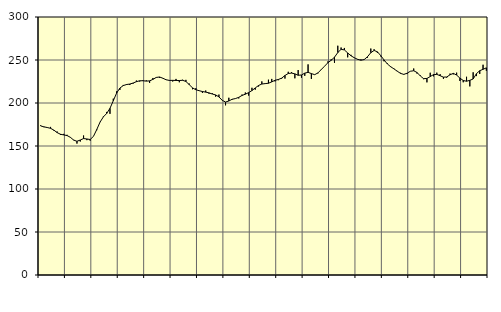
| Category | Piggar | Series 1 |
|---|---|---|
| nan | 174.1 | 173.34 |
| 87.0 | 171.9 | 172.28 |
| 87.0 | 171.8 | 171.48 |
| 87.0 | 172.2 | 170.55 |
| nan | 167.9 | 168.46 |
| 88.0 | 166.8 | 165.57 |
| 88.0 | 162.8 | 163.67 |
| 88.0 | 164.1 | 162.88 |
| nan | 163 | 162.13 |
| 89.0 | 159.8 | 160.11 |
| 89.0 | 157.2 | 156.85 |
| 89.0 | 152.8 | 155.47 |
| nan | 155.2 | 156.97 |
| 90.0 | 162.2 | 158.65 |
| 90.0 | 156.8 | 158.16 |
| 90.0 | 156.2 | 157.57 |
| nan | 161.4 | 161.25 |
| 91.0 | 168.4 | 169.17 |
| 91.0 | 178 | 177.82 |
| 91.0 | 184.4 | 183.87 |
| nan | 189.6 | 187.83 |
| 92.0 | 187.4 | 193.79 |
| 92.0 | 205 | 202.62 |
| 92.0 | 213.5 | 211.45 |
| nan | 215.2 | 217.35 |
| 93.0 | 221 | 220.23 |
| 93.0 | 222 | 221.47 |
| 93.0 | 220.9 | 222.05 |
| nan | 222.5 | 223.21 |
| 94.0 | 226.1 | 224.79 |
| 94.0 | 225 | 225.85 |
| 94.0 | 226.5 | 225.86 |
| nan | 226.3 | 225.44 |
| 95.0 | 223.4 | 225.72 |
| 95.0 | 229.1 | 227.46 |
| 95.0 | 229.5 | 229.7 |
| nan | 229.3 | 230.26 |
| 96.0 | 228.6 | 228.83 |
| 96.0 | 226.8 | 227 |
| 96.0 | 225.8 | 226.27 |
| nan | 225 | 226.34 |
| 97.0 | 228 | 226.21 |
| 97.0 | 224.1 | 226.14 |
| 97.0 | 227 | 226.4 |
| nan | 226.9 | 225.05 |
| 98.0 | 222.6 | 221.4 |
| 98.0 | 216 | 217.59 |
| 98.0 | 217.2 | 215.44 |
| nan | 214.5 | 214.3 |
| 99.0 | 211.7 | 213.34 |
| 99.0 | 214.5 | 212.63 |
| 99.0 | 210.8 | 211.78 |
| nan | 211.3 | 210.42 |
| 0.0 | 207.4 | 209.39 |
| 0.0 | 209.8 | 207.12 |
| 0.0 | 203.3 | 203.12 |
| nan | 197.3 | 201.14 |
| 1.0 | 206.1 | 202.31 |
| 1.0 | 203.8 | 204.35 |
| 1.0 | 205 | 205.15 |
| nan | 205.3 | 206.59 |
| 2.0 | 209.8 | 208.77 |
| 2.0 | 212.2 | 210.23 |
| 2.0 | 208.6 | 212.05 |
| nan | 217.7 | 214.48 |
| 3.0 | 215.5 | 217.5 |
| 3.0 | 219.2 | 220.37 |
| 3.0 | 225.1 | 222.04 |
| nan | 222.8 | 222.53 |
| 4.0 | 227.1 | 222.96 |
| 4.0 | 228 | 224.56 |
| 4.0 | 225.1 | 226.4 |
| nan | 226.5 | 227.35 |
| 5.0 | 228.2 | 228.9 |
| 5.0 | 228.4 | 232.01 |
| 5.0 | 236.3 | 234.28 |
| nan | 235.9 | 234.79 |
| 6.0 | 228.7 | 233.89 |
| 6.0 | 238.3 | 232.22 |
| 6.0 | 229.4 | 232.56 |
| nan | 231.6 | 234.74 |
| 7.0 | 244.9 | 235.63 |
| 7.0 | 228 | 234.21 |
| 7.0 | 233.1 | 232.95 |
| nan | 234.5 | 235 |
| 8.0 | 238.6 | 238.92 |
| 8.0 | 242.8 | 242.79 |
| 8.0 | 248.3 | 246.81 |
| nan | 250.8 | 249.69 |
| 9.0 | 246.7 | 253.22 |
| 9.0 | 266.6 | 258.64 |
| 9.0 | 264.5 | 262.42 |
| nan | 264 | 261.71 |
| 10.0 | 253.1 | 258.23 |
| 10.0 | 256 | 254.9 |
| 10.0 | 252.3 | 252.6 |
| nan | 251.1 | 250.81 |
| 11.0 | 250.7 | 249.75 |
| 11.0 | 250.2 | 250.51 |
| 11.0 | 252.7 | 253.79 |
| nan | 263.3 | 258.49 |
| 12.0 | 262.5 | 261.11 |
| 12.0 | 258.2 | 259.54 |
| 12.0 | 254.2 | 255.16 |
| nan | 248.5 | 250.12 |
| 13.0 | 246.2 | 245.49 |
| 13.0 | 242.7 | 242.21 |
| 13.0 | 240.1 | 239.71 |
| nan | 237.3 | 237 |
| 14.0 | 235.1 | 234.44 |
| 14.0 | 233.6 | 233.28 |
| 14.0 | 233.6 | 234.62 |
| nan | 237 | 236.92 |
| 15.0 | 240.1 | 237.49 |
| 15.0 | 234.2 | 235.5 |
| 15.0 | 232 | 231.44 |
| nan | 227.7 | 228.29 |
| 16.0 | 224 | 228.55 |
| 16.0 | 235.2 | 230.73 |
| 16.0 | 231 | 233.01 |
| nan | 235.3 | 233.25 |
| 17.0 | 233.5 | 231.71 |
| 17.0 | 228.1 | 230.08 |
| 17.0 | 229.5 | 230.25 |
| nan | 234.2 | 232.83 |
| 18.0 | 233.3 | 234.46 |
| 18.0 | 235.3 | 232.47 |
| 18.0 | 225.6 | 228.9 |
| nan | 224.1 | 226.15 |
| 19.0 | 230.5 | 225.3 |
| 19.0 | 219.3 | 226.37 |
| 19.0 | 235.7 | 227.91 |
| nan | 231.3 | 234.11 |
| 20.0 | 233.8 | 237.56 |
| 20.0 | 244.5 | 239.16 |
| 20.0 | 237.5 | 240.89 |